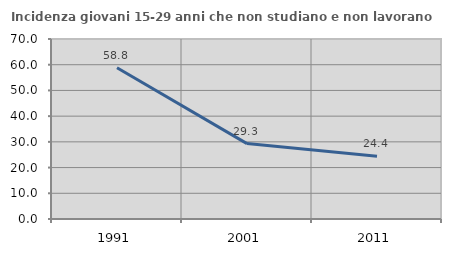
| Category | Incidenza giovani 15-29 anni che non studiano e non lavorano  |
|---|---|
| 1991.0 | 58.805 |
| 2001.0 | 29.327 |
| 2011.0 | 24.409 |